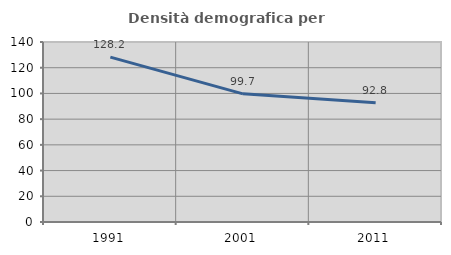
| Category | Densità demografica |
|---|---|
| 1991.0 | 128.225 |
| 2001.0 | 99.661 |
| 2011.0 | 92.767 |